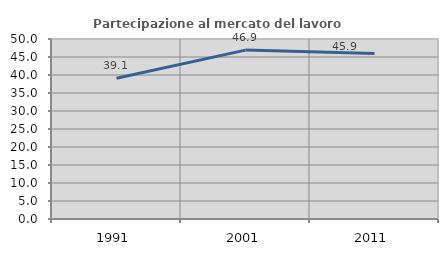
| Category | Partecipazione al mercato del lavoro  femminile |
|---|---|
| 1991.0 | 39.091 |
| 2001.0 | 46.914 |
| 2011.0 | 45.946 |